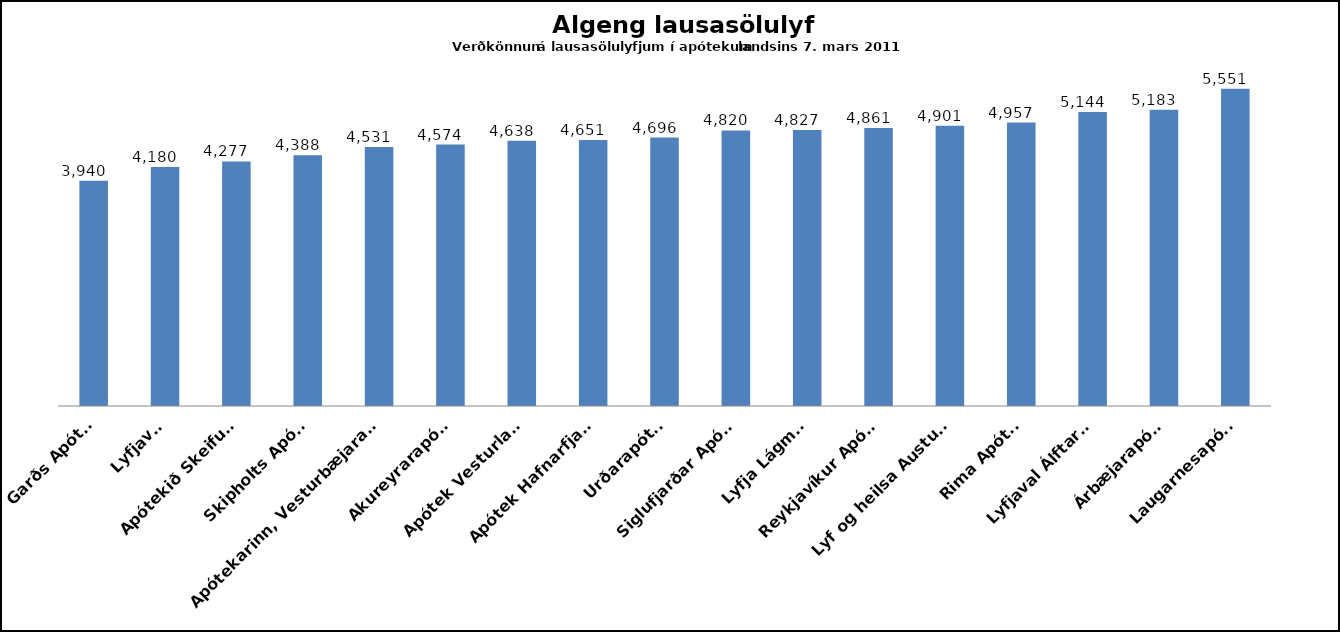
| Category | Series 0 |
|---|---|
| Garðs Apótek | 3940 |
| Lyfjaver | 4180 |
| Apótekið Skeifunni | 4277 |
| Skipholts Apótek | 4388 |
| Apótekarinn, Vesturbæjarapótek | 4531 |
| Akureyrarapótek | 4574 |
| Apótek Vesturlands | 4638 |
| Apótek Hafnarfjarðar | 4651 |
| Urðarapótek | 4696 |
| Siglufjarðar Apótek | 4820 |
| Lyfja Lágmúla | 4827 |
| Reykjavíkur Apótek | 4861 |
| Lyf og heilsa Austureri | 4901 |
| Rima Apótek | 4957 |
| Lyfjaval Álftarmýri | 5144 |
| Árbæjarapótek | 5183 |
| Laugarnesapótek | 5551 |